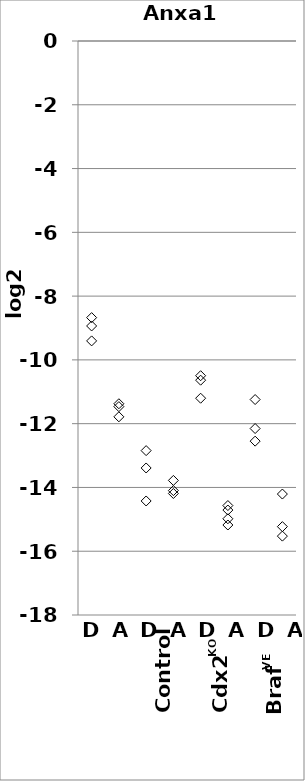
| Category | Anxa10 |
|---|---|
| 1.0 | -9.405 |
| 1.0 | -8.675 |
| 1.0 | -8.936 |
| 2.0 | -11.466 |
| 2.0 | -11.375 |
| 2.0 | -11.785 |
| 3.0 | -14.425 |
| 3.0 | -12.845 |
| 3.0 | -13.39 |
| 4.0 | -13.78 |
| 4.0 | -14.099 |
| 4.0 | -14.189 |
| 5.0 | -10.496 |
| 5.0 | -11.202 |
| 5.0 | -10.636 |
| 6.0 | -14.982 |
| 6.0 | -15.178 |
| 6.0 | -14.568 |
| 6.0 | -14.709 |
| 7.0 | -11.243 |
| 7.0 | -12.153 |
| 7.0 | -12.548 |
| 8.0 | -14.207 |
| 8.0 | -15.229 |
| 8.0 | -15.526 |